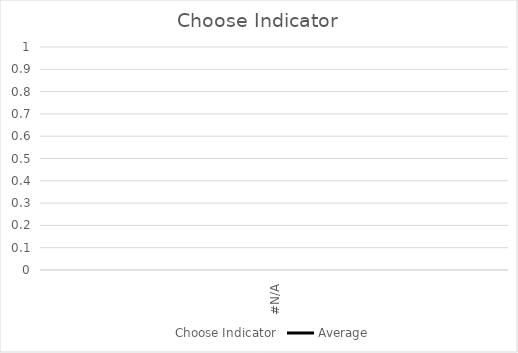
| Category | Choose Indicator |
|---|---|
| #N/A | 0 |